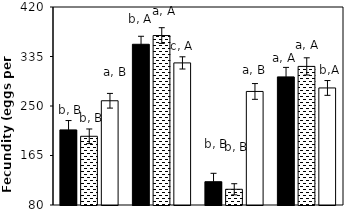
| Category | AB | AC | CK |
|---|---|---|---|
| aCO2-Bt | 209 | 198 | 259 |
| aCO2-Xy | 356 | 371 | 324 |
| eCO2-Bt | 120 | 107 | 275 |
| eCO2-Xy | 300 | 318 | 281 |